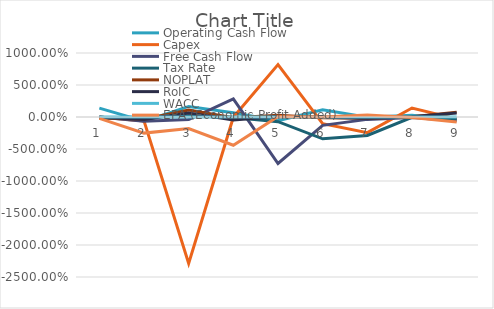
| Category | Operating Cash Flow | Capex | Free Cash Flow | Tax Rate | NOPLAT | RoIC | WACC | EPA (Economic Profit Added) |
|---|---|---|---|---|---|---|---|---|
| 0 | 1.383 | 0 | 0 | -0.204 | -0.107 | -0.028 | 0 | -0.218 |
| 1 | -0.66 | -0.608 | -0.656 | 0.01 | -0.348 | -0.399 | 0 | -2.517 |
| 2 | 1.654 | -22.887 | -0.403 | 0.208 | 1.092 | 0.63 | 0 | -1.802 |
| 3 | 0.661 | -0.045 | 2.831 | -0.061 | -0.131 | -0.462 | 0 | -4.409 |
| 4 | -0.566 | 8.19 | -7.265 | -0.728 | 0.292 | 0.065 | 0 | 0.078 |
| 5 | 1.12 | -1.037 | -1.301 | -3.41 | -0.118 | -0.042 | 0 | 0.001 |
| 6 | -0.041 | -2.441 | -0.372 | -2.883 | -0.19 | -0.183 | 0 | 0.323 |
| 7 | 0.265 | 1.409 | -0.097 | -0.052 | 0.049 | 0.054 | 0 | -0.065 |
| 8 | -0.446 | -0.292 | -0.576 | -0.279 | 0.762 | 0.639 | 0 | -0.781 |